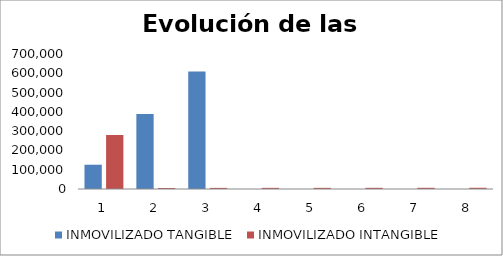
| Category | INMOVILIZADO TANGIBLE | INMOVILIZADO INTANGIBLE |
|---|---|---|
| 0 | 125920 | 280000 |
| 1 | 389500 | 5220 |
| 2 | 609362.5 | 5763.062 |
| 3 | 0 | 5907.139 |
| 4 | 0 | 5944.436 |
| 5 | 0 | 6093.047 |
| 6 | 0 | 6245.373 |
| 7 | 0 | 6401.508 |